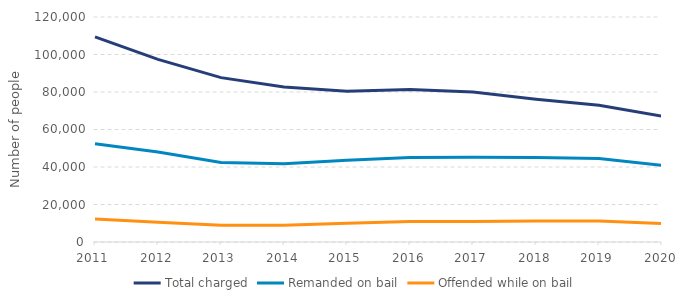
| Category | Total charged | Remanded on bail | Offended while on bail |
|---|---|---|---|
| 2011.0 | 109360 | 52458 | 12246 |
| 2012.0 | 97426 | 48004 | 10595 |
| 2013.0 | 87652 | 42391 | 8909 |
| 2014.0 | 82681 | 41701 | 8926 |
| 2015.0 | 80384 | 43665 | 9995 |
| 2016.0 | 81320 | 45004 | 10949 |
| 2017.0 | 79985 | 45222 | 10919 |
| 2018.0 | 76190 | 45016 | 11201 |
| 2019.0 | 72899 | 44490 | 11206 |
| 2020.0 | 67109 | 40879 | 9878 |